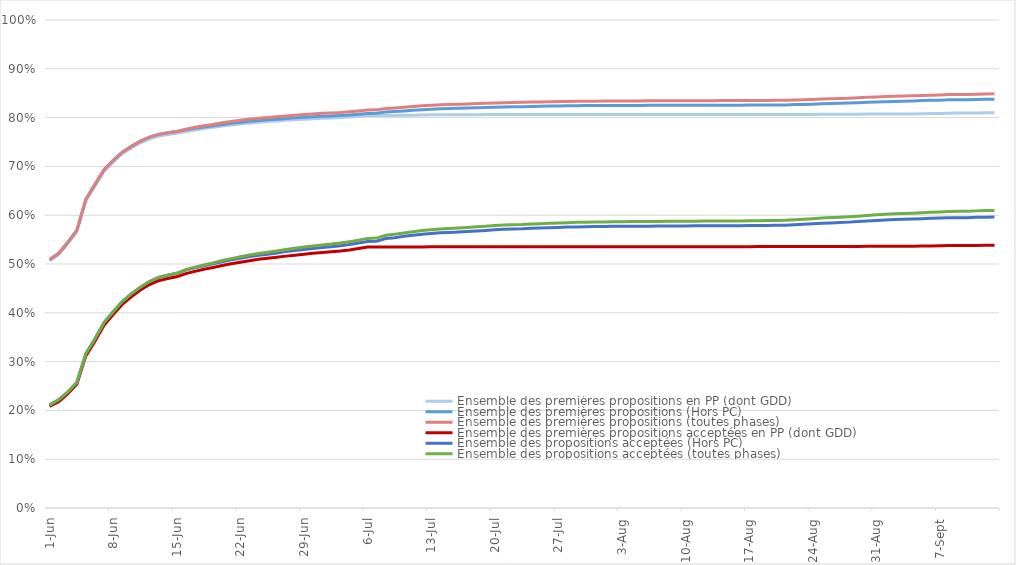
| Category | Ensemble des premières propositions en PP (dont GDD) | Ensemble des premières propositions (Hors PC) | Ensemble des premières propositions (toutes phases) | Ensemble des premières propositions acceptées en PP (dont GDD) | Ensemble des propositions acceptées (Hors PC) | Ensemble des propositions acceptées (toutes phases) |
|---|---|---|---|---|---|---|
| 2023-06-01 | 0.506 | 0.509 | 0.509 | 0.208 | 0.211 | 0.211 |
| 2023-06-02 | 0.519 | 0.522 | 0.522 | 0.218 | 0.222 | 0.222 |
| 2023-06-03 | 0.541 | 0.544 | 0.544 | 0.234 | 0.237 | 0.237 |
| 2023-06-04 | 0.566 | 0.569 | 0.569 | 0.253 | 0.257 | 0.257 |
| 2023-06-05 | 0.63 | 0.633 | 0.633 | 0.312 | 0.316 | 0.316 |
| 2023-06-06 | 0.66 | 0.663 | 0.663 | 0.342 | 0.347 | 0.347 |
| 2023-06-07 | 0.69 | 0.693 | 0.693 | 0.375 | 0.38 | 0.38 |
| 2023-06-08 | 0.709 | 0.712 | 0.712 | 0.397 | 0.402 | 0.402 |
| 2023-06-09 | 0.726 | 0.729 | 0.729 | 0.417 | 0.423 | 0.423 |
| 2023-06-10 | 0.738 | 0.741 | 0.741 | 0.433 | 0.439 | 0.439 |
| 2023-06-11 | 0.748 | 0.752 | 0.752 | 0.447 | 0.453 | 0.453 |
| 2023-06-12 | 0.757 | 0.76 | 0.76 | 0.458 | 0.464 | 0.464 |
| 2023-06-13 | 0.762 | 0.766 | 0.766 | 0.466 | 0.472 | 0.472 |
| 2023-06-14 | 0.766 | 0.769 | 0.769 | 0.47 | 0.477 | 0.477 |
| 2023-06-15 | 0.768 | 0.772 | 0.772 | 0.474 | 0.481 | 0.481 |
| 2023-06-16 | 0.772 | 0.775 | 0.776 | 0.48 | 0.488 | 0.488 |
| 2023-06-17 | 0.775 | 0.778 | 0.78 | 0.485 | 0.492 | 0.493 |
| 2023-06-18 | 0.777 | 0.781 | 0.783 | 0.489 | 0.496 | 0.498 |
| 2023-06-19 | 0.78 | 0.783 | 0.786 | 0.493 | 0.5 | 0.502 |
| 2023-06-20 | 0.783 | 0.786 | 0.789 | 0.497 | 0.505 | 0.507 |
| 2023-06-21 | 0.785 | 0.788 | 0.792 | 0.501 | 0.508 | 0.511 |
| 2023-06-22 | 0.787 | 0.791 | 0.795 | 0.504 | 0.512 | 0.515 |
| 2023-06-23 | 0.789 | 0.792 | 0.797 | 0.507 | 0.515 | 0.519 |
| 2023-06-24 | 0.79 | 0.794 | 0.799 | 0.51 | 0.518 | 0.522 |
| 2023-06-25 | 0.792 | 0.796 | 0.8 | 0.512 | 0.52 | 0.524 |
| 2023-06-26 | 0.793 | 0.797 | 0.802 | 0.514 | 0.523 | 0.527 |
| 2023-06-27 | 0.794 | 0.798 | 0.804 | 0.516 | 0.525 | 0.53 |
| 2023-06-28 | 0.796 | 0.799 | 0.805 | 0.518 | 0.528 | 0.532 |
| 2023-06-29 | 0.797 | 0.801 | 0.806 | 0.52 | 0.53 | 0.535 |
| 2023-06-30 | 0.798 | 0.802 | 0.807 | 0.522 | 0.532 | 0.537 |
| 2023-07-01 | 0.799 | 0.803 | 0.809 | 0.524 | 0.534 | 0.539 |
| 2023-07-02 | 0.799 | 0.803 | 0.81 | 0.525 | 0.535 | 0.541 |
| 2023-07-03 | 0.8 | 0.804 | 0.811 | 0.527 | 0.537 | 0.543 |
| 2023-07-04 | 0.801 | 0.805 | 0.812 | 0.529 | 0.54 | 0.546 |
| 2023-07-05 | 0.803 | 0.807 | 0.814 | 0.532 | 0.543 | 0.549 |
| 2023-07-06 | 0.804 | 0.809 | 0.815 | 0.535 | 0.546 | 0.552 |
| 2023-07-07 | 0.804 | 0.809 | 0.816 | 0.535 | 0.547 | 0.553 |
| 2023-07-08 | 0.804 | 0.811 | 0.819 | 0.535 | 0.552 | 0.559 |
| 2023-07-09 | 0.805 | 0.812 | 0.82 | 0.535 | 0.554 | 0.561 |
| 2023-07-10 | 0.805 | 0.814 | 0.821 | 0.535 | 0.557 | 0.564 |
| 2023-07-11 | 0.805 | 0.815 | 0.823 | 0.535 | 0.559 | 0.566 |
| 2023-07-12 | 0.805 | 0.816 | 0.824 | 0.535 | 0.561 | 0.568 |
| 2023-07-13 | 0.806 | 0.817 | 0.825 | 0.535 | 0.563 | 0.57 |
| 2023-07-14 | 0.806 | 0.818 | 0.826 | 0.535 | 0.564 | 0.572 |
| 2023-07-15 | 0.806 | 0.818 | 0.827 | 0.535 | 0.565 | 0.573 |
| 2023-07-16 | 0.806 | 0.819 | 0.827 | 0.535 | 0.566 | 0.574 |
| 2023-07-17 | 0.806 | 0.819 | 0.828 | 0.535 | 0.567 | 0.575 |
| 2023-07-18 | 0.806 | 0.82 | 0.829 | 0.535 | 0.568 | 0.576 |
| 2023-07-19 | 0.806 | 0.821 | 0.829 | 0.535 | 0.569 | 0.577 |
| 2023-07-20 | 0.806 | 0.821 | 0.83 | 0.535 | 0.57 | 0.579 |
| 2023-07-21 | 0.806 | 0.822 | 0.831 | 0.535 | 0.571 | 0.58 |
| 2023-07-22 | 0.806 | 0.822 | 0.831 | 0.535 | 0.572 | 0.581 |
| 2023-07-23 | 0.806 | 0.822 | 0.831 | 0.535 | 0.572 | 0.581 |
| 2023-07-24 | 0.806 | 0.823 | 0.832 | 0.535 | 0.573 | 0.582 |
| 2023-07-25 | 0.806 | 0.823 | 0.832 | 0.535 | 0.574 | 0.583 |
| 2023-07-26 | 0.806 | 0.824 | 0.833 | 0.535 | 0.574 | 0.583 |
| 2023-07-27 | 0.806 | 0.824 | 0.833 | 0.535 | 0.575 | 0.584 |
| 2023-07-28 | 0.806 | 0.824 | 0.833 | 0.536 | 0.576 | 0.585 |
| 2023-07-29 | 0.806 | 0.824 | 0.833 | 0.536 | 0.576 | 0.585 |
| 2023-07-30 | 0.806 | 0.825 | 0.834 | 0.536 | 0.576 | 0.586 |
| 2023-07-31 | 0.806 | 0.825 | 0.834 | 0.536 | 0.577 | 0.586 |
| 2023-08-01 | 0.806 | 0.825 | 0.834 | 0.536 | 0.577 | 0.586 |
| 2023-08-02 | 0.806 | 0.825 | 0.834 | 0.536 | 0.577 | 0.586 |
| 2023-08-03 | 0.806 | 0.825 | 0.834 | 0.536 | 0.577 | 0.587 |
| 2023-08-04 | 0.806 | 0.825 | 0.834 | 0.536 | 0.577 | 0.587 |
| 2023-08-05 | 0.806 | 0.825 | 0.834 | 0.536 | 0.578 | 0.587 |
| 2023-08-06 | 0.806 | 0.825 | 0.834 | 0.536 | 0.578 | 0.587 |
| 2023-08-07 | 0.806 | 0.825 | 0.834 | 0.536 | 0.578 | 0.587 |
| 2023-08-08 | 0.806 | 0.825 | 0.834 | 0.536 | 0.578 | 0.587 |
| 2023-08-09 | 0.806 | 0.825 | 0.835 | 0.536 | 0.578 | 0.587 |
| 2023-08-10 | 0.806 | 0.825 | 0.835 | 0.536 | 0.578 | 0.588 |
| 2023-08-11 | 0.806 | 0.825 | 0.835 | 0.536 | 0.578 | 0.588 |
| 2023-08-12 | 0.806 | 0.825 | 0.835 | 0.536 | 0.578 | 0.588 |
| 2023-08-13 | 0.806 | 0.825 | 0.835 | 0.536 | 0.578 | 0.588 |
| 2023-08-14 | 0.806 | 0.825 | 0.835 | 0.536 | 0.578 | 0.588 |
| 2023-08-15 | 0.806 | 0.826 | 0.835 | 0.536 | 0.578 | 0.588 |
| 2023-08-16 | 0.806 | 0.826 | 0.835 | 0.536 | 0.579 | 0.588 |
| 2023-08-17 | 0.806 | 0.826 | 0.835 | 0.536 | 0.579 | 0.589 |
| 2023-08-18 | 0.806 | 0.826 | 0.835 | 0.536 | 0.579 | 0.589 |
| 2023-08-19 | 0.806 | 0.826 | 0.835 | 0.536 | 0.579 | 0.589 |
| 2023-08-20 | 0.806 | 0.826 | 0.835 | 0.536 | 0.579 | 0.589 |
| 2023-08-21 | 0.806 | 0.826 | 0.835 | 0.536 | 0.58 | 0.59 |
| 2023-08-22 | 0.806 | 0.827 | 0.836 | 0.536 | 0.581 | 0.591 |
| 2023-08-23 | 0.806 | 0.827 | 0.837 | 0.536 | 0.581 | 0.592 |
| 2023-08-24 | 0.807 | 0.828 | 0.837 | 0.536 | 0.582 | 0.593 |
| 2023-08-25 | 0.807 | 0.828 | 0.838 | 0.536 | 0.583 | 0.594 |
| 2023-08-26 | 0.807 | 0.829 | 0.839 | 0.536 | 0.584 | 0.595 |
| 2023-08-27 | 0.807 | 0.829 | 0.839 | 0.536 | 0.585 | 0.596 |
| 2023-08-28 | 0.807 | 0.83 | 0.84 | 0.536 | 0.586 | 0.597 |
| 2023-08-29 | 0.807 | 0.83 | 0.841 | 0.536 | 0.587 | 0.598 |
| 2023-08-30 | 0.807 | 0.831 | 0.841 | 0.536 | 0.588 | 0.599 |
| 2023-08-31 | 0.807 | 0.832 | 0.842 | 0.536 | 0.589 | 0.601 |
| 2023-09-01 | 0.807 | 0.833 | 0.843 | 0.536 | 0.59 | 0.602 |
| 2023-09-02 | 0.807 | 0.833 | 0.844 | 0.536 | 0.591 | 0.603 |
| 2023-09-03 | 0.807 | 0.834 | 0.844 | 0.536 | 0.591 | 0.603 |
| 2023-09-04 | 0.808 | 0.834 | 0.845 | 0.537 | 0.592 | 0.604 |
| 2023-09-05 | 0.808 | 0.835 | 0.845 | 0.537 | 0.593 | 0.605 |
| 2023-09-06 | 0.808 | 0.835 | 0.846 | 0.537 | 0.594 | 0.606 |
| 2023-09-07 | 0.809 | 0.836 | 0.846 | 0.537 | 0.594 | 0.607 |
| 2023-09-08 | 0.809 | 0.836 | 0.847 | 0.538 | 0.595 | 0.608 |
| 2023-09-09 | 0.809 | 0.837 | 0.847 | 0.538 | 0.595 | 0.608 |
| 2023-09-10 | 0.809 | 0.837 | 0.847 | 0.538 | 0.595 | 0.608 |
| 2023-09-11 | 0.809 | 0.837 | 0.848 | 0.538 | 0.596 | 0.609 |
| 2023-09-12 | 0.81 | 0.838 | 0.848 | 0.538 | 0.596 | 0.61 |
| 2023-09-13 | 0.81 | 0.838 | 0.849 | 0.538 | 0.596 | 0.61 |